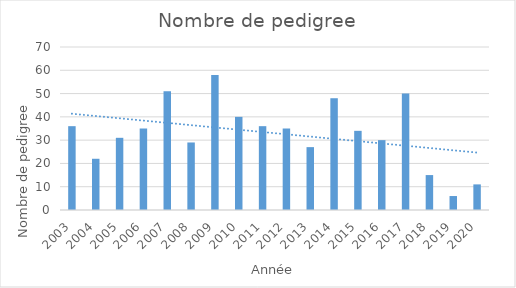
| Category | Series 0 |
|---|---|
| 2003.0 | 36 |
| 2004.0 | 22 |
| 2005.0 | 31 |
| 2006.0 | 35 |
| 2007.0 | 51 |
| 2008.0 | 29 |
| 2009.0 | 58 |
| 2010.0 | 40 |
| 2011.0 | 36 |
| 2012.0 | 35 |
| 2013.0 | 27 |
| 2014.0 | 48 |
| 2015.0 | 34 |
| 2016.0 | 30 |
| 2017.0 | 50 |
| 2018.0 | 15 |
| 2019.0 | 6 |
| 2020.0 | 11 |